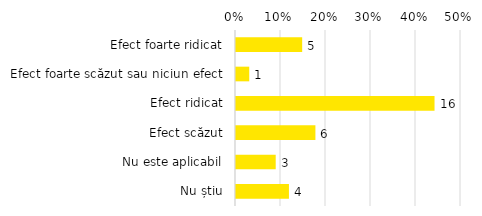
| Category | Total |
|---|---|
| Efect foarte ridicat | 0.147 |
| Efect foarte scăzut sau niciun efect | 0.029 |
| Efect ridicat | 0.441 |
| Efect scăzut | 0.176 |
| Nu este aplicabil | 0.088 |
| Nu știu | 0.118 |